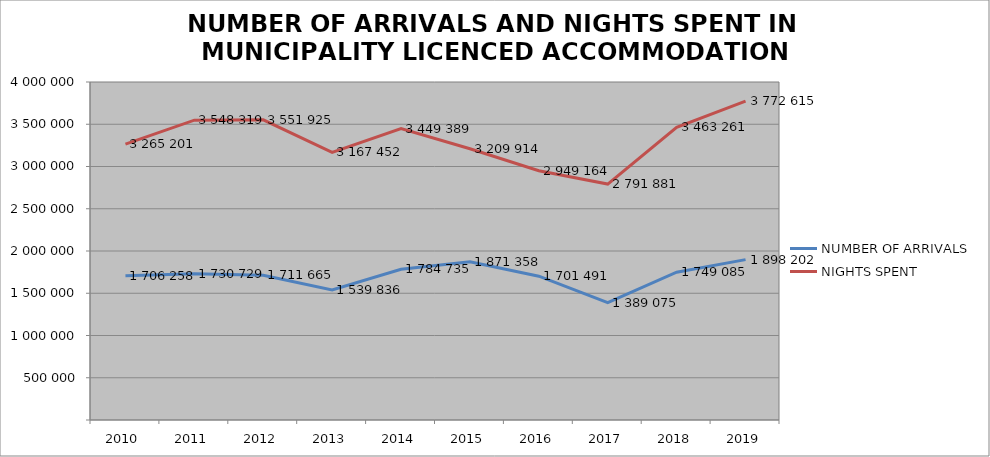
| Category | NUMBER OF ARRIVALS | NIGHTS SPENT |
|---|---|---|
| 2010 | 1706258 | 3265201 |
| 2011 | 1730729 | 3548319 |
| 2012 | 1711665 | 3551925 |
| 2013 | 1539836 | 3167452 |
| 2014 | 1784735 | 3449389 |
| 2015 | 1871358 | 3209914 |
| 2016 | 1701491 | 2949164 |
| 2017 | 1389075 | 2791881 |
| 2018 | 1749085 | 3463261 |
| 2019 | 1898202 | 3772615 |